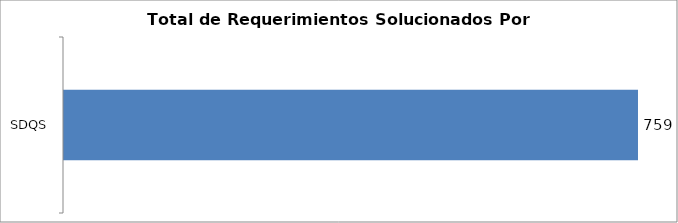
| Category | Total |
|---|---|
| SDQS | 759 |